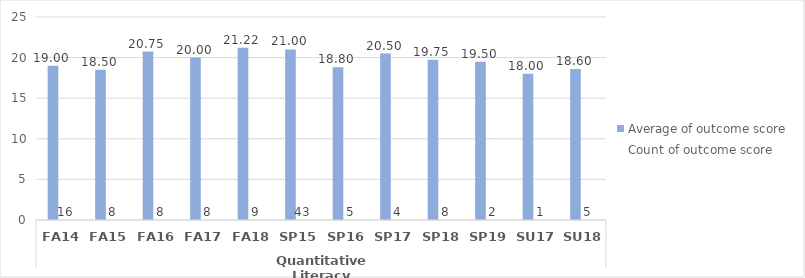
| Category | PTA.AAS - Average of outcome score | PTA.AAS - Count of outcome score |
|---|---|---|
| 0 | 19 | 16 |
| 1 | 18.5 | 8 |
| 2 | 20.75 | 8 |
| 3 | 20 | 8 |
| 4 | 21.222 | 9 |
| 5 | 21 | 43 |
| 6 | 18.8 | 5 |
| 7 | 20.5 | 4 |
| 8 | 19.75 | 8 |
| 9 | 19.5 | 2 |
| 10 | 18 | 1 |
| 11 | 18.6 | 5 |